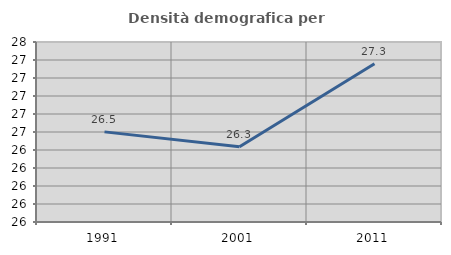
| Category | Densità demografica |
|---|---|
| 1991.0 | 26.501 |
| 2001.0 | 26.335 |
| 2011.0 | 27.259 |